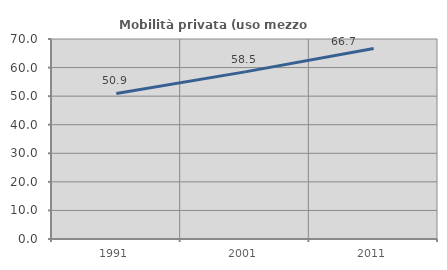
| Category | Mobilità privata (uso mezzo privato) |
|---|---|
| 1991.0 | 50.93 |
| 2001.0 | 58.487 |
| 2011.0 | 66.667 |